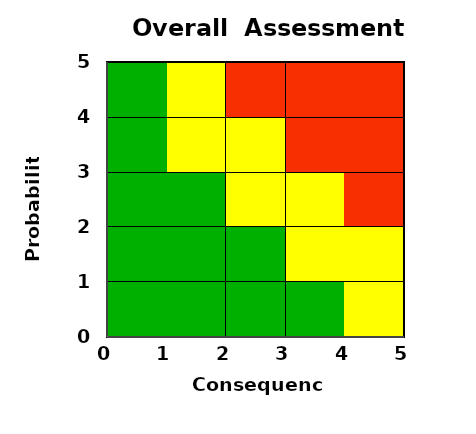
| Category | Series 1 |
|---|---|
| 2.6033882783882785 | 0 |